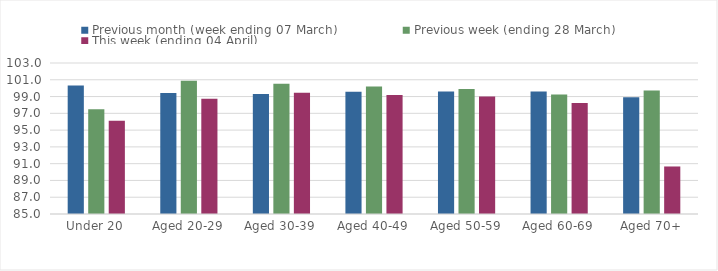
| Category | Previous month (week ending 07 March) | Previous week (ending 28 March) | This week (ending 04 April) |
|---|---|---|---|
| Under 20 | 100.315 | 97.476 | 96.109 |
| Aged 20-29 | 99.415 | 100.891 | 98.745 |
| Aged 30-39 | 99.291 | 100.535 | 99.444 |
| Aged 40-49 | 99.569 | 100.192 | 99.193 |
| Aged 50-59 | 99.611 | 99.909 | 99.021 |
| Aged 60-69 | 99.614 | 99.255 | 98.231 |
| Aged 70+ | 98.927 | 99.732 | 90.665 |